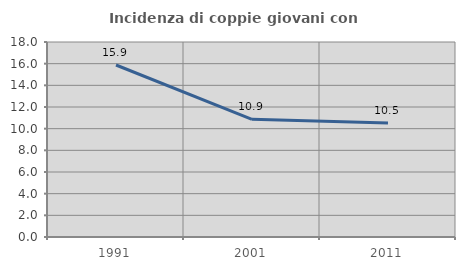
| Category | Incidenza di coppie giovani con figli |
|---|---|
| 1991.0 | 15.876 |
| 2001.0 | 10.865 |
| 2011.0 | 10.522 |